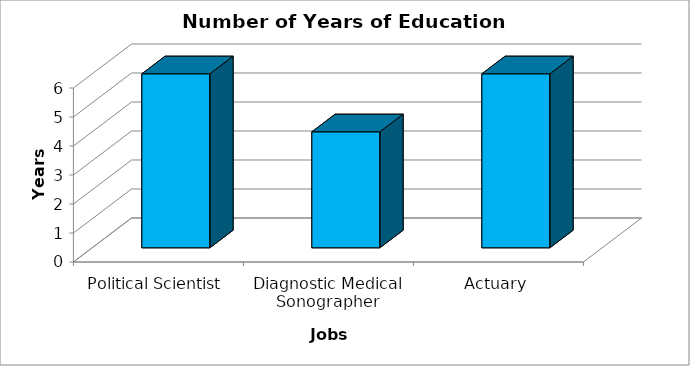
| Category | Series 0 |
|---|---|
| Political Scientist | 6 |
| Diagnostic Medical Sonographer | 4 |
| Actuary | 6 |